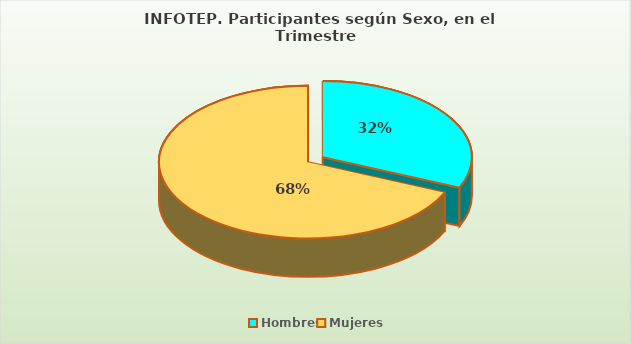
| Category | Series 0 |
|---|---|
| Hombres | 19818 |
| Mujeres | 43043 |